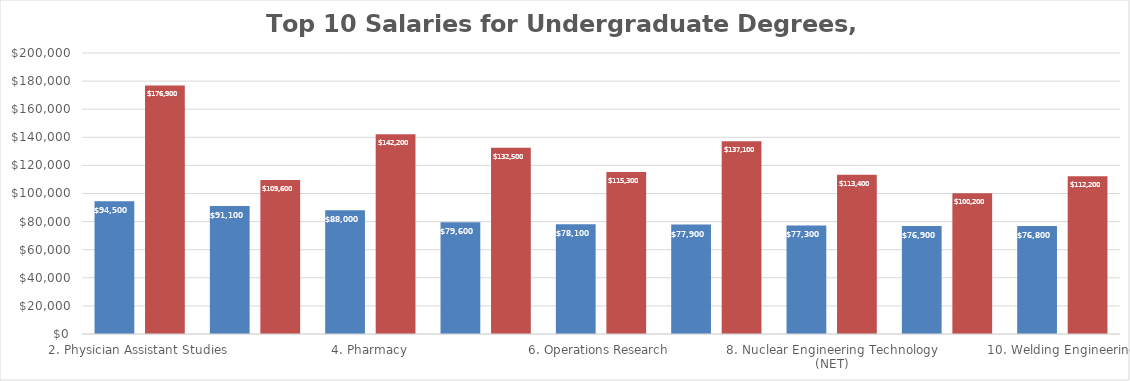
| Category | Early-Career Salary  | Mid-Career Salary |
|---|---|---|
| 2. Physician Assistant Studies | 94500 | 176900 |
| 3. Electrical Engineering & Computer Science | 91100 | 109600 |
| 4. Pharmacy | 88000 | 142200 |
| 5. Metallurgical Engineering | 79600 | 132500 |
| 6. Operations Research | 78100 | 115300 |
| 7. Computer Science (CS) & Physics | 77900 | 137100 |
| 8. Nuclear Engineering Technology (NET) | 77300 | 113400 |
| 9. Petroleum Land Management | 76900 | 100200 |
| 10. Welding Engineering | 76800 | 112200 |